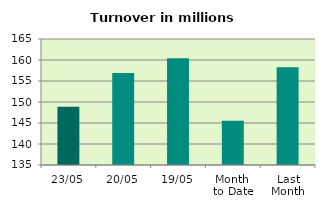
| Category | Series 0 |
|---|---|
| 23/05 | 148.88 |
| 20/05 | 156.88 |
| 19/05 | 160.421 |
| Month 
to Date | 145.549 |
| Last
Month | 158.303 |